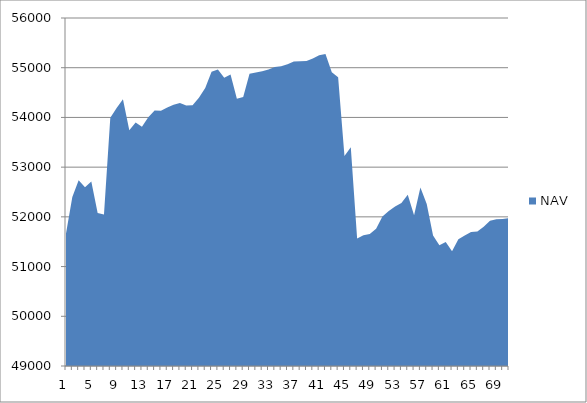
| Category | NAV |
|---|---|
| 0 | 51667 |
| 1 | 52397 |
| 2 | 52733.957 |
| 3 | 52597.875 |
| 4 | 52708.772 |
| 5 | 52075.184 |
| 6 | 52046.775 |
| 7 | 53991.219 |
| 8 | 54189.909 |
| 9 | 54364.909 |
| 10 | 53739.909 |
| 11 | 53899.542 |
| 12 | 53812.294 |
| 13 | 54003.961 |
| 14 | 54140.037 |
| 15 | 54132.37 |
| 16 | 54197.37 |
| 17 | 54255.812 |
| 18 | 54292.622 |
| 19 | 54240.699 |
| 20 | 54246.834 |
| 21 | 54397.391 |
| 22 | 54592.197 |
| 23 | 54920.119 |
| 24 | 54963.245 |
| 25 | 54796.799 |
| 26 | 54863.963 |
| 27 | 54375.975 |
| 28 | 54409.015 |
| 29 | 54878.402 |
| 30 | 54905.151 |
| 31 | 54927.958 |
| 32 | 54964.157 |
| 33 | 55012.385 |
| 34 | 55031.616 |
| 35 | 55070.791 |
| 36 | 55126.461 |
| 37 | 55131.71 |
| 38 | 55133.391 |
| 39 | 55184.783 |
| 40 | 55249.119 |
| 41 | 55278.196 |
| 42 | 54909.993 |
| 43 | 54807.052 |
| 44 | 53224.092 |
| 45 | 53401.214 |
| 46 | 51567.133 |
| 47 | 51627.536 |
| 48 | 51656.382 |
| 49 | 51762.295 |
| 50 | 52007.329 |
| 51 | 52120.149 |
| 52 | 52206.26 |
| 53 | 52279.944 |
| 54 | 52443.406 |
| 55 | 52034.315 |
| 56 | 52592.093 |
| 57 | 52259.795 |
| 58 | 51622.988 |
| 59 | 51427.586 |
| 60 | 51492.401 |
| 61 | 51307.336 |
| 62 | 51550.9 |
| 63 | 51625.058 |
| 64 | 51693.986 |
| 65 | 51704.014 |
| 66 | 51802.294 |
| 67 | 51922.294 |
| 68 | 51950.294 |
| 69 | 51956.603 |
| 70 | 51977.321 |